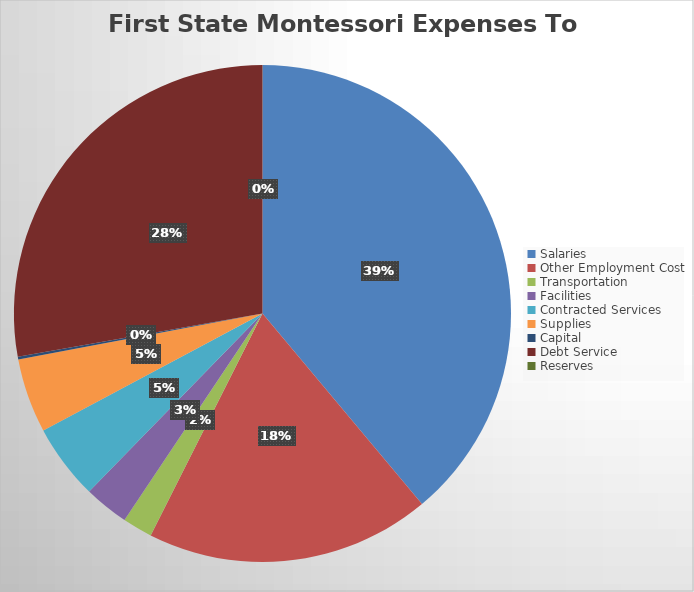
| Category | Series 0 |
|---|---|
| Salaries | 1070634.33 |
| Other Employment Cost | 509569.22 |
| Transportation | 53503.69 |
| Facilities | 80153.22 |
| Contracted Services | 135100.33 |
| Supplies | 133243.08 |
| Capital | 4982.6 |
| Debt Service | 764340.32 |
| Reserves | 0 |